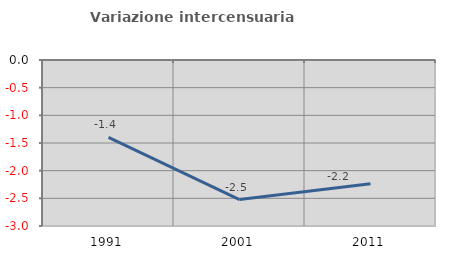
| Category | Variazione intercensuaria annua |
|---|---|
| 1991.0 | -1.4 |
| 2001.0 | -2.522 |
| 2011.0 | -2.238 |